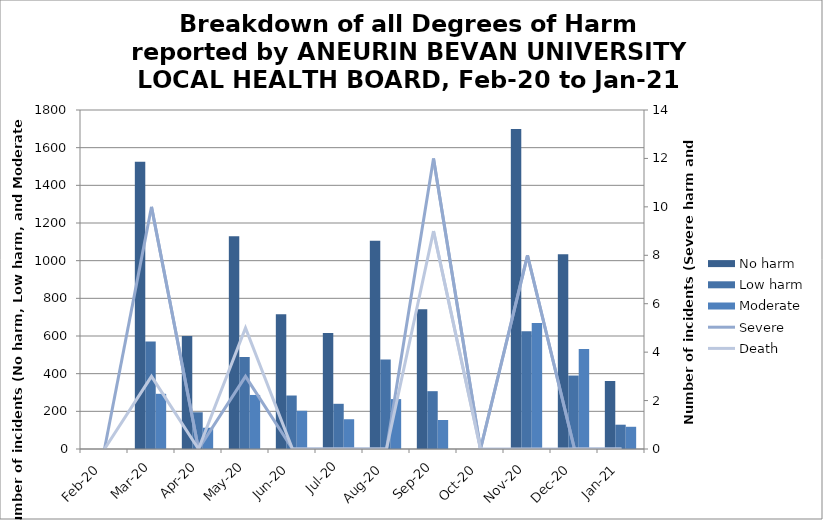
| Category | No harm | Low harm | Moderate |
|---|---|---|---|
| Feb-20 | 0 | 0 | 0 |
| Mar-20 | 1525 | 571 | 293 |
| Apr-20 | 600 | 195 | 113 |
| May-20 | 1129 | 489 | 287 |
| Jun-20 | 715 | 284 | 203 |
| Jul-20 | 616 | 240 | 158 |
| Aug-20 | 1106 | 475 | 265 |
| Sep-20 | 742 | 307 | 154 |
| Oct-20 | 0 | 0 | 0 |
| Nov-20 | 1699 | 625 | 669 |
| Dec-20 | 1034 | 390 | 531 |
| Jan-21 | 361 | 129 | 118 |